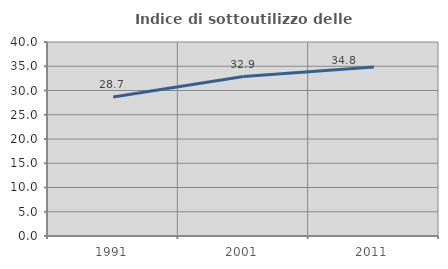
| Category | Indice di sottoutilizzo delle abitazioni  |
|---|---|
| 1991.0 | 28.669 |
| 2001.0 | 32.871 |
| 2011.0 | 34.83 |